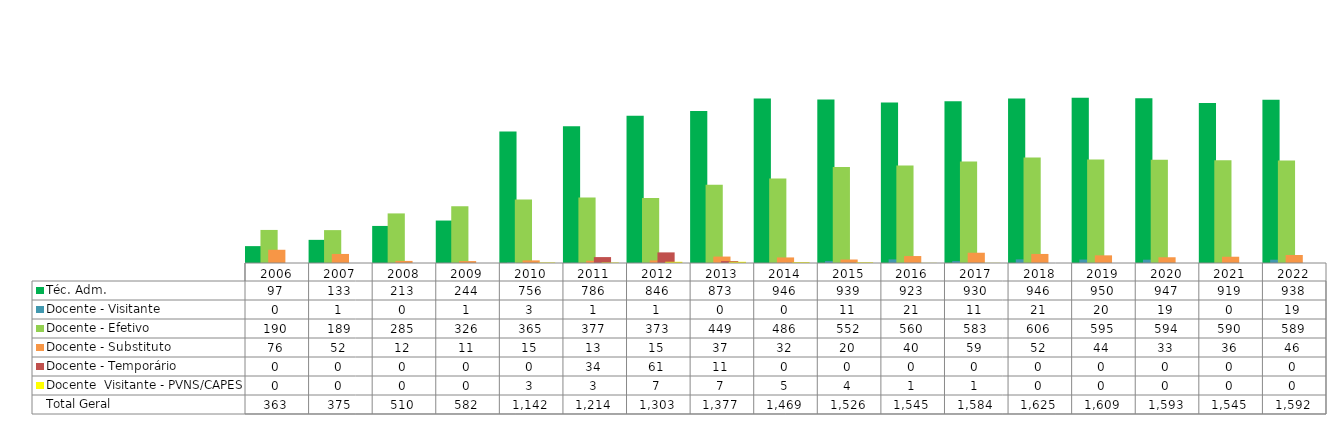
| Category | Téc. Adm. | Docente - Visitante | Docente - Efetivo | Docente - Substituto | Docente - Temporário | Docente  Visitante - PVNS/CAPES | Total Geral |
|---|---|---|---|---|---|---|---|
| 2006.0 | 97 | 0 | 190 | 76 | 0 | 0 | 363 |
| 2007.0 | 133 | 1 | 189 | 52 | 0 | 0 | 375 |
| 2008.0 | 213 | 0 | 285 | 12 | 0 | 0 | 510 |
| 2009.0 | 244 | 1 | 326 | 11 | 0 | 0 | 582 |
| 2010.0 | 756 | 3 | 365 | 15 | 0 | 3 | 1142 |
| 2011.0 | 786 | 1 | 377 | 13 | 34 | 3 | 1214 |
| 2012.0 | 846 | 1 | 373 | 15 | 61 | 7 | 1303 |
| 2013.0 | 873 | 0 | 449 | 37 | 11 | 7 | 1377 |
| 2014.0 | 946 | 0 | 486 | 32 | 0 | 5 | 1469 |
| 2015.0 | 939 | 11 | 552 | 20 | 0 | 4 | 1526 |
| 2016.0 | 923 | 21 | 560 | 40 | 0 | 1 | 1545 |
| 2017.0 | 930 | 11 | 583 | 59 | 0 | 1 | 1584 |
| 2018.0 | 946 | 21 | 606 | 52 | 0 | 0 | 1625 |
| 2019.0 | 950 | 20 | 595 | 44 | 0 | 0 | 1609 |
| 2020.0 | 947 | 19 | 594 | 33 | 0 | 0 | 1593 |
| 2021.0 | 919 | 0 | 590 | 36 | 0 | 0 | 1545 |
| 2022.0 | 938 | 19 | 589 | 46 | 0 | 0 | 1592 |